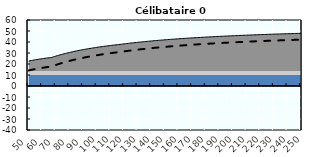
| Category | Coin fiscal moyen (somme des composantes) | Taux moyen d'imposition net en % du salaire brut |
|---|---|---|
| 50.0 | 22.676 | 14.132 |
| 51.0 | 22.93 | 14.414 |
| 52.0 | 23.174 | 14.685 |
| 53.0 | 23.409 | 14.945 |
| 54.0 | 23.635 | 15.196 |
| 55.0 | 23.852 | 15.438 |
| 56.0 | 24.062 | 15.671 |
| 57.0 | 24.265 | 15.896 |
| 58.0 | 24.461 | 16.114 |
| 59.0 | 24.65 | 16.324 |
| 60.0 | 24.833 | 16.527 |
| 61.0 | 25.009 | 16.723 |
| 62.0 | 25.18 | 16.913 |
| 63.0 | 25.346 | 17.097 |
| 64.0 | 25.506 | 17.275 |
| 65.0 | 25.662 | 17.448 |
| 66.0 | 25.813 | 17.615 |
| 67.0 | 26.019 | 17.844 |
| 68.0 | 26.425 | 18.294 |
| 69.0 | 26.819 | 18.732 |
| 70.0 | 27.202 | 19.157 |
| 71.0 | 27.574 | 19.571 |
| 72.0 | 27.936 | 19.973 |
| 73.0 | 28.288 | 20.363 |
| 74.0 | 28.63 | 20.744 |
| 75.0 | 28.963 | 21.114 |
| 76.0 | 29.288 | 21.474 |
| 77.0 | 29.604 | 21.825 |
| 78.0 | 29.912 | 22.167 |
| 79.0 | 30.212 | 22.5 |
| 80.0 | 30.505 | 22.825 |
| 81.0 | 30.79 | 23.142 |
| 82.0 | 31.068 | 23.451 |
| 83.0 | 31.34 | 23.753 |
| 84.0 | 31.605 | 24.048 |
| 85.0 | 31.865 | 24.336 |
| 86.0 | 32.118 | 24.617 |
| 87.0 | 32.365 | 24.891 |
| 88.0 | 32.606 | 25.159 |
| 89.0 | 32.842 | 25.422 |
| 90.0 | 33.073 | 25.678 |
| 91.0 | 33.299 | 25.929 |
| 92.0 | 33.52 | 26.174 |
| 93.0 | 33.736 | 26.414 |
| 94.0 | 33.948 | 26.649 |
| 95.0 | 34.155 | 26.879 |
| 96.0 | 34.358 | 27.104 |
| 97.0 | 34.556 | 27.325 |
| 98.0 | 34.751 | 27.541 |
| 99.0 | 34.942 | 27.753 |
| 100.0 | 35.129 | 27.96 |
| 101.0 | 35.312 | 28.164 |
| 102.0 | 35.491 | 28.363 |
| 103.0 | 35.667 | 28.558 |
| 104.0 | 35.84 | 28.75 |
| 105.0 | 36.009 | 28.938 |
| 106.0 | 36.175 | 29.123 |
| 107.0 | 36.339 | 29.304 |
| 108.0 | 36.499 | 29.482 |
| 109.0 | 36.656 | 29.656 |
| 110.0 | 36.81 | 29.827 |
| 111.0 | 36.961 | 29.996 |
| 112.0 | 37.11 | 30.161 |
| 113.0 | 37.256 | 30.323 |
| 114.0 | 37.4 | 30.483 |
| 115.0 | 37.541 | 30.639 |
| 116.0 | 37.68 | 30.793 |
| 117.0 | 37.818 | 30.947 |
| 118.0 | 37.978 | 31.125 |
| 119.0 | 38.136 | 31.3 |
| 120.0 | 38.292 | 31.473 |
| 121.0 | 38.444 | 31.643 |
| 122.0 | 38.595 | 31.809 |
| 123.0 | 38.742 | 31.974 |
| 124.0 | 38.888 | 32.135 |
| 125.0 | 39.031 | 32.294 |
| 126.0 | 39.172 | 32.45 |
| 127.0 | 39.31 | 32.604 |
| 128.0 | 39.447 | 32.756 |
| 129.0 | 39.581 | 32.905 |
| 130.0 | 39.714 | 33.052 |
| 131.0 | 39.844 | 33.197 |
| 132.0 | 39.972 | 33.339 |
| 133.0 | 40.098 | 33.479 |
| 134.0 | 40.223 | 33.617 |
| 135.0 | 40.345 | 33.754 |
| 136.0 | 40.466 | 33.888 |
| 137.0 | 40.585 | 34.02 |
| 138.0 | 40.703 | 34.15 |
| 139.0 | 40.818 | 34.279 |
| 140.0 | 40.932 | 34.405 |
| 141.0 | 41.045 | 34.53 |
| 142.0 | 41.155 | 34.653 |
| 143.0 | 41.265 | 34.774 |
| 144.0 | 41.372 | 34.894 |
| 145.0 | 41.479 | 35.012 |
| 146.0 | 41.583 | 35.128 |
| 147.0 | 41.687 | 35.243 |
| 148.0 | 41.789 | 35.356 |
| 149.0 | 41.889 | 35.468 |
| 150.0 | 41.989 | 35.578 |
| 151.0 | 42.086 | 35.687 |
| 152.0 | 42.183 | 35.794 |
| 153.0 | 42.279 | 35.9 |
| 154.0 | 42.373 | 36.005 |
| 155.0 | 42.466 | 36.108 |
| 156.0 | 42.557 | 36.21 |
| 157.0 | 42.648 | 36.31 |
| 158.0 | 42.737 | 36.41 |
| 159.0 | 42.826 | 36.508 |
| 160.0 | 42.913 | 36.605 |
| 161.0 | 42.999 | 36.7 |
| 162.0 | 43.084 | 36.795 |
| 163.0 | 43.168 | 36.888 |
| 164.0 | 43.251 | 36.98 |
| 165.0 | 43.333 | 37.071 |
| 166.0 | 43.414 | 37.161 |
| 167.0 | 43.494 | 37.25 |
| 168.0 | 43.573 | 37.338 |
| 169.0 | 43.651 | 37.425 |
| 170.0 | 43.728 | 37.51 |
| 171.0 | 43.805 | 37.595 |
| 172.0 | 43.88 | 37.679 |
| 173.0 | 43.955 | 37.762 |
| 174.0 | 44.028 | 37.843 |
| 175.0 | 44.101 | 37.924 |
| 176.0 | 44.173 | 38.004 |
| 177.0 | 44.244 | 38.083 |
| 178.0 | 44.315 | 38.161 |
| 179.0 | 44.384 | 38.239 |
| 180.0 | 44.453 | 38.315 |
| 181.0 | 44.521 | 38.391 |
| 182.0 | 44.589 | 38.466 |
| 183.0 | 44.655 | 38.54 |
| 184.0 | 44.721 | 38.613 |
| 185.0 | 44.786 | 38.685 |
| 186.0 | 44.851 | 38.757 |
| 187.0 | 44.914 | 38.828 |
| 188.0 | 44.978 | 38.898 |
| 189.0 | 45.04 | 38.967 |
| 190.0 | 45.102 | 39.035 |
| 191.0 | 45.163 | 39.103 |
| 192.0 | 45.223 | 39.171 |
| 193.0 | 45.283 | 39.237 |
| 194.0 | 45.342 | 39.303 |
| 195.0 | 45.401 | 39.368 |
| 196.0 | 45.459 | 39.432 |
| 197.0 | 45.517 | 39.496 |
| 198.0 | 45.573 | 39.559 |
| 199.0 | 45.63 | 39.622 |
| 200.0 | 45.685 | 39.684 |
| 201.0 | 45.741 | 39.745 |
| 202.0 | 45.795 | 39.806 |
| 203.0 | 45.849 | 39.866 |
| 204.0 | 45.903 | 39.925 |
| 205.0 | 45.956 | 39.984 |
| 206.0 | 46.009 | 40.042 |
| 207.0 | 46.061 | 40.1 |
| 208.0 | 46.112 | 40.157 |
| 209.0 | 46.163 | 40.214 |
| 210.0 | 46.214 | 40.27 |
| 211.0 | 46.264 | 40.326 |
| 212.0 | 46.313 | 40.381 |
| 213.0 | 46.362 | 40.435 |
| 214.0 | 46.411 | 40.489 |
| 215.0 | 46.459 | 40.543 |
| 216.0 | 46.507 | 40.596 |
| 217.0 | 46.554 | 40.649 |
| 218.0 | 46.601 | 40.701 |
| 219.0 | 46.648 | 40.752 |
| 220.0 | 46.694 | 40.803 |
| 221.0 | 46.739 | 40.854 |
| 222.0 | 46.785 | 40.904 |
| 223.0 | 46.829 | 40.954 |
| 224.0 | 46.874 | 41.003 |
| 225.0 | 46.918 | 41.052 |
| 226.0 | 46.961 | 41.101 |
| 227.0 | 47.005 | 41.149 |
| 228.0 | 47.047 | 41.196 |
| 229.0 | 47.09 | 41.243 |
| 230.0 | 47.132 | 41.29 |
| 231.0 | 47.174 | 41.337 |
| 232.0 | 47.215 | 41.383 |
| 233.0 | 47.256 | 41.428 |
| 234.0 | 47.297 | 41.473 |
| 235.0 | 47.337 | 41.518 |
| 236.0 | 47.377 | 41.562 |
| 237.0 | 47.417 | 41.607 |
| 238.0 | 47.456 | 41.65 |
| 239.0 | 47.495 | 41.693 |
| 240.0 | 47.534 | 41.736 |
| 241.0 | 47.572 | 41.779 |
| 242.0 | 47.61 | 41.821 |
| 243.0 | 47.648 | 41.863 |
| 244.0 | 47.685 | 41.905 |
| 245.0 | 47.723 | 41.946 |
| 246.0 | 47.759 | 41.987 |
| 247.0 | 47.796 | 42.027 |
| 248.0 | 47.832 | 42.068 |
| 249.0 | 47.868 | 42.107 |
| 250.0 | 47.904 | 42.147 |